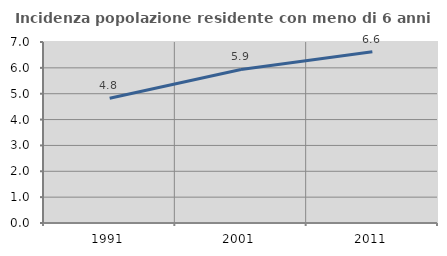
| Category | Incidenza popolazione residente con meno di 6 anni |
|---|---|
| 1991.0 | 4.823 |
| 2001.0 | 5.938 |
| 2011.0 | 6.627 |